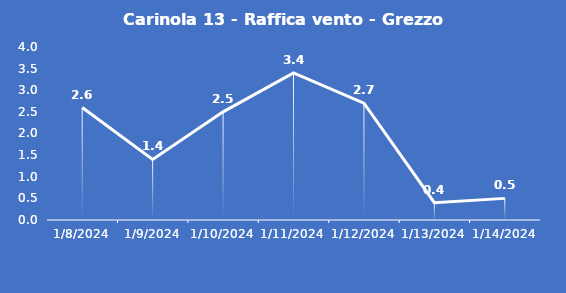
| Category | Carinola 13 - Raffica vento - Grezzo (m/s) |
|---|---|
| 1/8/24 | 2.6 |
| 1/9/24 | 1.4 |
| 1/10/24 | 2.5 |
| 1/11/24 | 3.4 |
| 1/12/24 | 2.7 |
| 1/13/24 | 0.4 |
| 1/14/24 | 0.5 |